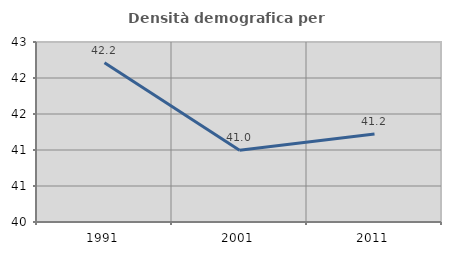
| Category | Densità demografica |
|---|---|
| 1991.0 | 42.213 |
| 2001.0 | 40.997 |
| 2011.0 | 41.221 |